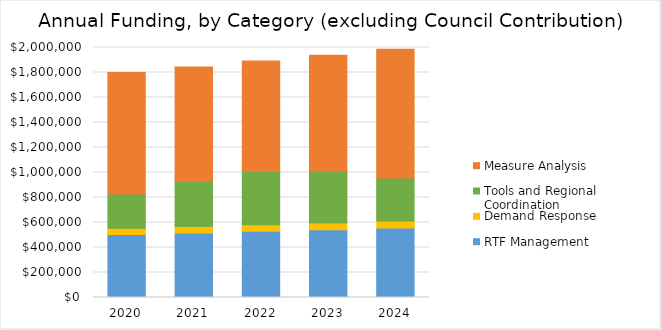
| Category | RTF Management | Demand Response | Tools and Regional Coordination | Measure Analysis |
|---|---|---|---|---|
| 2020.0 | 504000 | 50000 | 275000 | 971000 |
| 2021.0 | 516700 | 51200 | 360800 | 916300 |
| 2022.0 | 529500 | 52500 | 425600 | 883500 |
| 2023.0 | 542700 | 53800 | 413500 | 928400 |
| 2024.0 | 556300 | 55200 | 345400 | 1029900 |